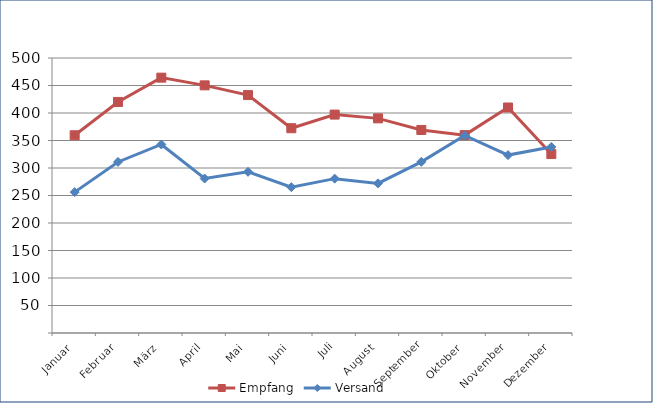
| Category | Empfang | Versand |
|---|---|---|
| Januar | 359.49 | 256.145 |
| Februar | 420.107 | 310.953 |
| März | 464.282 | 342.779 |
| April | 450.278 | 280.872 |
| Mai | 432.607 | 293.041 |
| Juni | 372.303 | 265.188 |
| Juli | 397.122 | 280.635 |
| August | 390.236 | 272.061 |
| September | 369.153 | 311.181 |
| Oktober | 359.75 | 359.117 |
| November | 409.983 | 323.516 |
| Dezember | 325.324 | 338.228 |